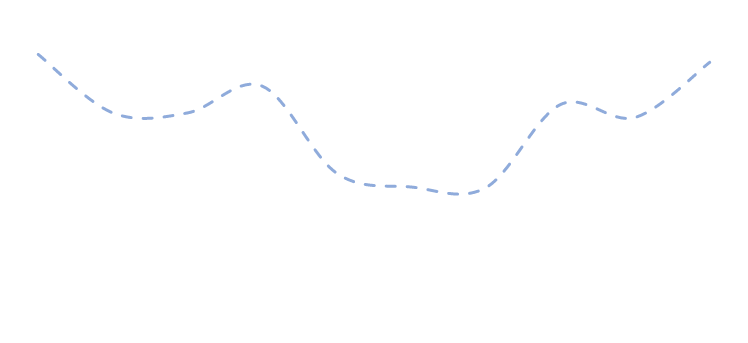
| Category | Series 0 |
|---|---|
| 0 | 26552.649 |
| 1 | 25486.64 |
| 2 | 25486.501 |
| 3 | 25976.86 |
| 4 | 24386.396 |
| 5 | 24134.326 |
| 6 | 24123.267 |
| 7 | 25640.108 |
| 8 | 25404.537 |
| 9 | 26409.776 |